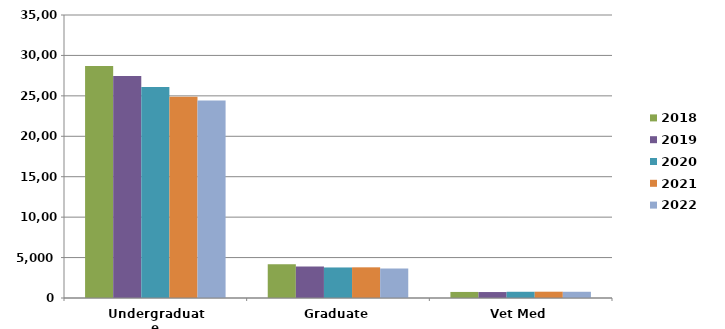
| Category | 2018 | 2019 | 2020 | 2021 | 2022 |
|---|---|---|---|---|---|
| Undergraduate | 28706 | 27444 | 26094 | 24885.05 | 24441 |
| Graduate | 4179 | 3896 | 3777 | 3793.47 | 3648 |
| Vet Med | 749 | 737 | 771 | 779.55 | 770 |